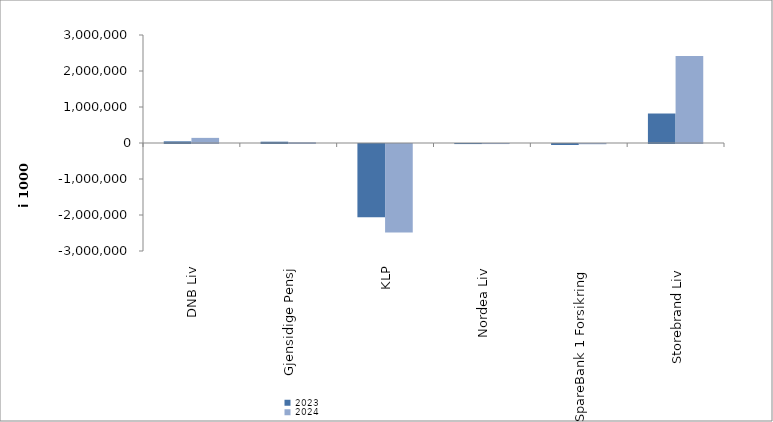
| Category | 2023 | 2024 |
|---|---|---|
| DNB Liv | 46187 | 142093 |
| Gjensidige Pensj | 36306 | 22481 |
| KLP | -2034368.132 | -2455267.232 |
| Nordea Liv | -1911.312 | -1336.184 |
| SpareBank 1 Forsikring | -28538.819 | -7141.413 |
| Storebrand Liv | 819261.934 | 2416464.154 |